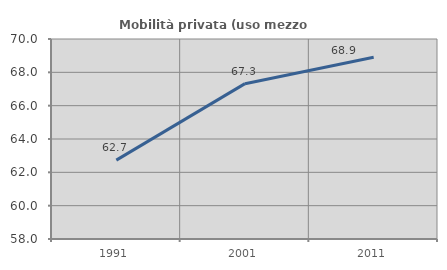
| Category | Mobilità privata (uso mezzo privato) |
|---|---|
| 1991.0 | 62.731 |
| 2001.0 | 67.32 |
| 2011.0 | 68.91 |